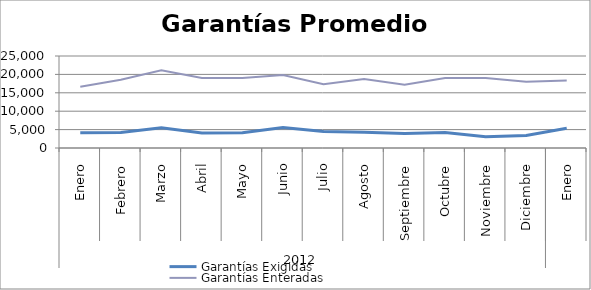
| Category | Garantías Exigidas | Garantías Enteradas |
|---|---|---|
| 0 | 4146.8 | 16662.483 |
| 1 | 4190.531 | 18572.749 |
| 2 | 5482.211 | 21128.648 |
| 3 | 4079.038 | 18997.51 |
| 4 | 4141.554 | 19005.364 |
| 5 | 5549.139 | 19818.91 |
| 6 | 4487.023 | 17351.39 |
| 7 | 4277.924 | 18719.955 |
| 8 | 3940.893 | 17217.403 |
| 9 | 4180.69 | 19046.939 |
| 10 | 3056.997 | 19028.425 |
| 11 | 3426.799 | 17994.819 |
| 12 | 5390.461 | 18317.043 |